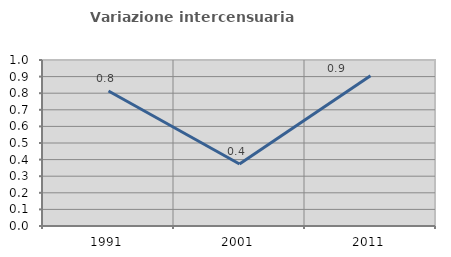
| Category | Variazione intercensuaria annua |
|---|---|
| 1991.0 | 0.813 |
| 2001.0 | 0.373 |
| 2011.0 | 0.905 |